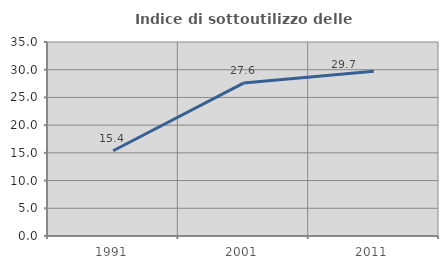
| Category | Indice di sottoutilizzo delle abitazioni  |
|---|---|
| 1991.0 | 15.385 |
| 2001.0 | 27.586 |
| 2011.0 | 29.73 |